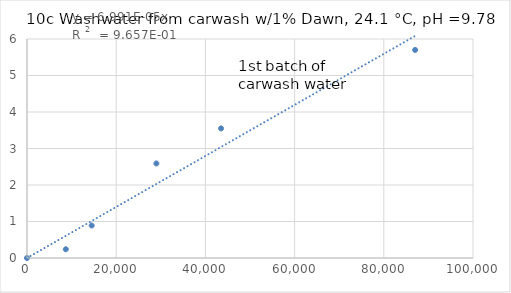
| Category | Series 0 |
|---|---|
| 0.0 | 0 |
| 8702.290076335878 | 0.24 |
| 14503.81679389313 | 0.89 |
| 29007.63358778626 | 2.59 |
| 43511.45038167939 | 3.55 |
| 87022.90076335878 | 5.7 |